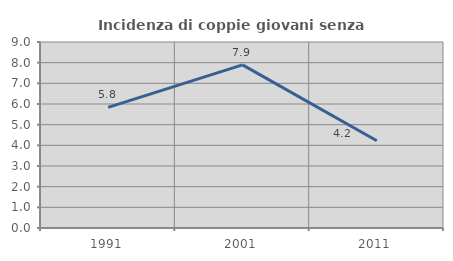
| Category | Incidenza di coppie giovani senza figli |
|---|---|
| 1991.0 | 5.837 |
| 2001.0 | 7.896 |
| 2011.0 | 4.22 |